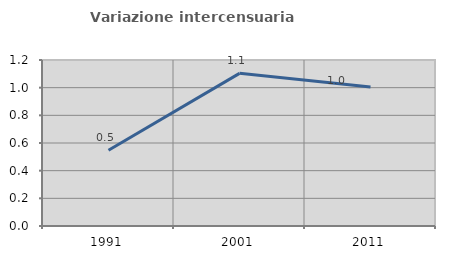
| Category | Variazione intercensuaria annua |
|---|---|
| 1991.0 | 0.547 |
| 2001.0 | 1.103 |
| 2011.0 | 1.004 |